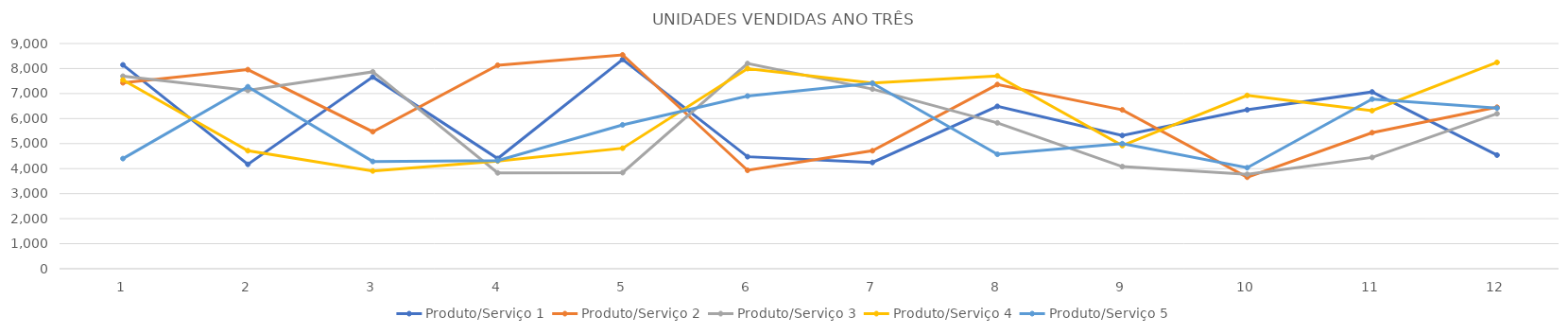
| Category | Produto/Serviço 1 | Produto/Serviço 2 | Produto/Serviço 3 | Produto/Serviço 4 | Produto/Serviço 5 |
|---|---|---|---|---|---|
| 0 | 8146 | 7430 | 7694 | 7544 | 4401 |
| 1 | 4171 | 7956 | 7127 | 4716 | 7273 |
| 2 | 7662 | 5475 | 7868 | 3907 | 4286 |
| 3 | 4404 | 8133 | 3831 | 4302 | 4322 |
| 4 | 8362 | 8546 | 3840 | 4816 | 5750 |
| 5 | 4476 | 3933 | 8201 | 7998 | 6900 |
| 6 | 4247 | 4715 | 7181 | 7419 | 7411 |
| 7 | 6489 | 7362 | 5828 | 7707 | 4573 |
| 8 | 5323 | 6348 | 4082 | 4919 | 4999 |
| 9 | 6351 | 3656 | 3773 | 6927 | 4036 |
| 10 | 7065 | 5437 | 4447 | 6317 | 6777 |
| 11 | 4540 | 6454 | 6195 | 8245 | 6421 |